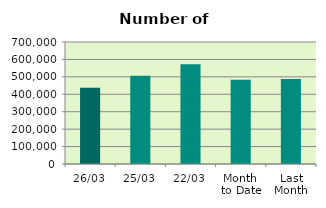
| Category | Series 0 |
|---|---|
| 26/03 | 437980 |
| 25/03 | 505976 |
| 22/03 | 572978 |
| Month 
to Date | 483100.222 |
| Last
Month | 488116.6 |